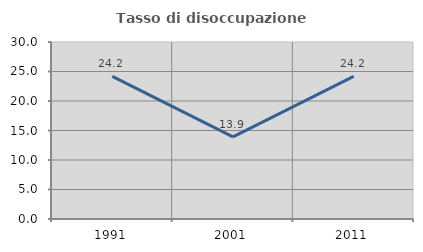
| Category | Tasso di disoccupazione giovanile  |
|---|---|
| 1991.0 | 24.176 |
| 2001.0 | 13.91 |
| 2011.0 | 24.171 |